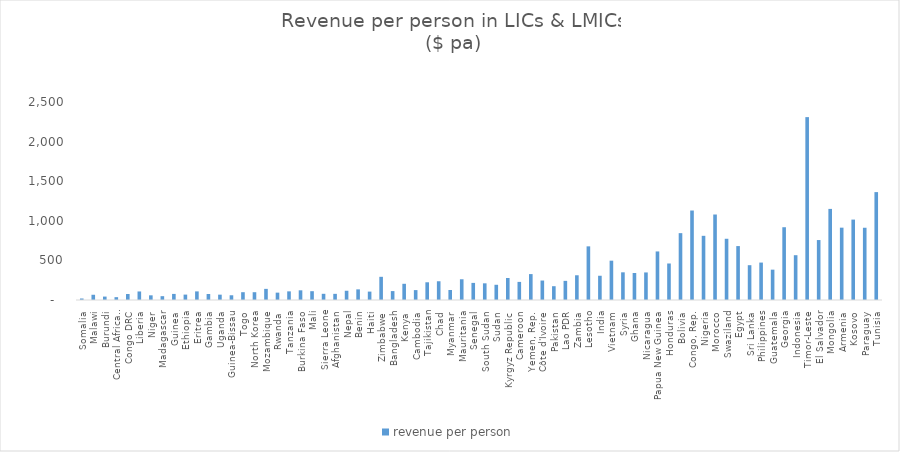
| Category | revenue per person |
|---|---|
| Somalia | 19.056 |
| Malawi | 66.15 |
| Burundi | 43.12 |
| Central African Republic | 35.84 |
| Congo DRC | 75.426 |
| Liberia | 107.83 |
| Niger | 59.04 |
| Madagascar | 48.32 |
| Guinea | 76.82 |
| Ethiopia | 68.15 |
| Eritrea | 108.78 |
| Gambia | 75.48 |
| Uganda | 67.437 |
| Guinea-Bissau | 59.8 |
| Togo | 98.511 |
| North Korea | 98.406 |
| Mozambique | 140.48 |
| Rwanda | 92.958 |
| Tanzania | 109.127 |
| Burkina Faso | 122.205 |
| Mali | 111.207 |
| Sierra Leone | 78.2 |
| Afghanistan | 77.7 |
| Nepal | 116.743 |
| Benin | 134.34 |
| Haiti | 106.11 |
| Zimbabwe | 292.74 |
| Bangladesh | 112.5 |
| Kenya | 204.613 |
| Cambodia | 125.011 |
| Tajikistan | 223.74 |
| Chad | 236.684 |
| Myanmar | 126.445 |
| Mauritania | 261.82 |
| Senegal | 215.919 |
| South Sudan | 210.56 |
| Sudan | 192.1 |
| Kyrgyz Republic | 277.863 |
| Cameroon | 228.6 |
| Yemen, Rep. | 327.18 |
| Côte d'Ivoire | 245.848 |
| Pakistan | 174.244 |
| Lao PDR | 241.601 |
| Zambia | 312.28 |
| Lesotho | 677.35 |
| India | 306.15 |
| Vietnam | 496.51 |
| Syria | 349.428 |
| Ghana | 340.942 |
| Nicaragua | 347.99 |
| Papua New Guinea | 613.05 |
| Honduras | 460.987 |
| Bolivia | 844.05 |
| Congo, Rep. | 1129.824 |
| Nigeria | 810.29 |
| Morocco | 1079.492 |
| Swaziland | 773.08 |
| Egypt | 680.783 |
| Sri Lanka | 439.461 |
| Philippines | 472.535 |
| Guatemala | 383.094 |
| Georgia | 918.882 |
| Indonesia | 565.64 |
| Timor-Leste | 2309.1 |
| El Salvador | 756.894 |
| Mongolia | 1150.191 |
| Armenia | 913.345 |
| Kosovo | 1015.29 |
| Paraguay | 912.253 |
| Tunisia | 1362.282 |